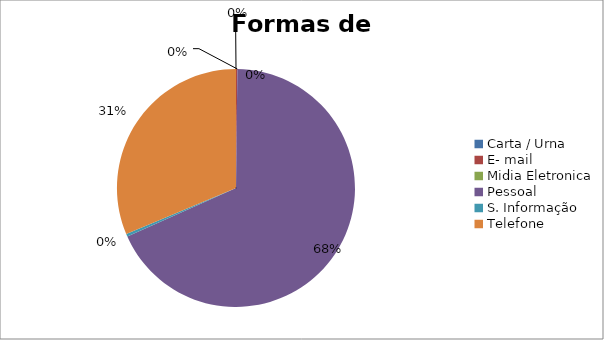
| Category | Series 0 |
|---|---|
| Carta / Urna | 0 |
| E- mail | 0.002 |
| Midia Eletronica | 0 |
| Pessoal | 0.681 |
| S. Informação | 0.004 |
| Telefone | 0.313 |